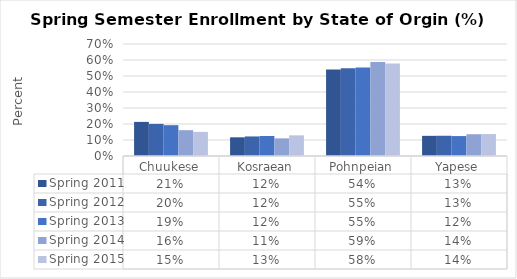
| Category | Spring 2011 | Spring 2012 | Spring 2013 | Spring 2014 | Spring 2015 |
|---|---|---|---|---|---|
| Chuukese | 0.213 | 0.201 | 0.193 | 0.161 | 0.151 |
| Kosraean | 0.117 | 0.122 | 0.125 | 0.11 | 0.129 |
| Pohnpeian | 0.541 | 0.548 | 0.554 | 0.587 | 0.578 |
| Yapese | 0.126 | 0.127 | 0.125 | 0.136 | 0.137 |